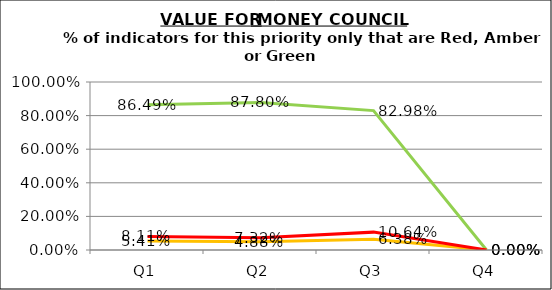
| Category | Green | Amber | Red |
|---|---|---|---|
| Q1 | 0.865 | 0.054 | 0.081 |
| Q2 | 0.878 | 0.049 | 0.073 |
| Q3 | 0.83 | 0.064 | 0.106 |
| Q4 | 0 | 0 | 0 |